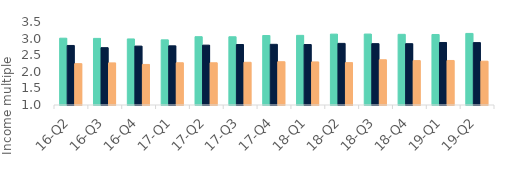
| Category | First-time
buyers | Homemovers | Homowner remortgaging |
|---|---|---|---|
| 16-Q2 | 3.012 | 2.793 | 2.246 |
| 16-Q3 | 3.006 | 2.726 | 2.268 |
| 16-Q4 | 2.989 | 2.774 | 2.222 |
| 17-Q1 | 2.963 | 2.782 | 2.272 |
| 17-Q2 | 3.057 | 2.803 | 2.272 |
| 17-Q3 | 3.055 | 2.822 | 2.287 |
| 17-Q4 | 3.093 | 2.827 | 2.304 |
| 18-Q1 | 3.097 | 2.822 | 2.297 |
| 18-Q2 | 3.134 | 2.856 | 2.276 |
| 18-Q3 | 3.137 | 2.848 | 2.363 |
| 18-Q4 | 3.129 | 2.847 | 2.337 |
| 19-Q1 | 3.124 | 2.883 | 2.341 |
| 19-Q2 | 3.156 | 2.879 | 2.32 |